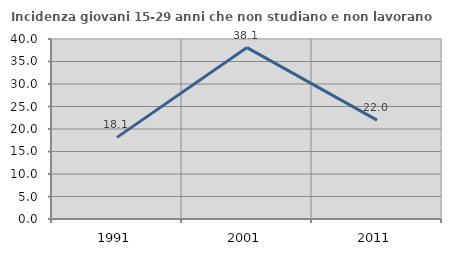
| Category | Incidenza giovani 15-29 anni che non studiano e non lavorano  |
|---|---|
| 1991.0 | 18.137 |
| 2001.0 | 38.095 |
| 2011.0 | 21.978 |